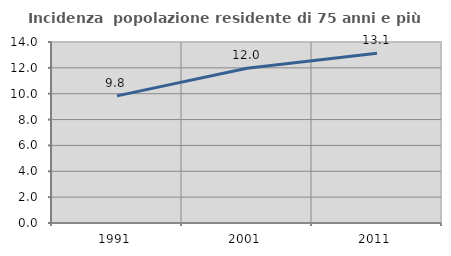
| Category | Incidenza  popolazione residente di 75 anni e più |
|---|---|
| 1991.0 | 9.833 |
| 2001.0 | 11.968 |
| 2011.0 | 13.121 |